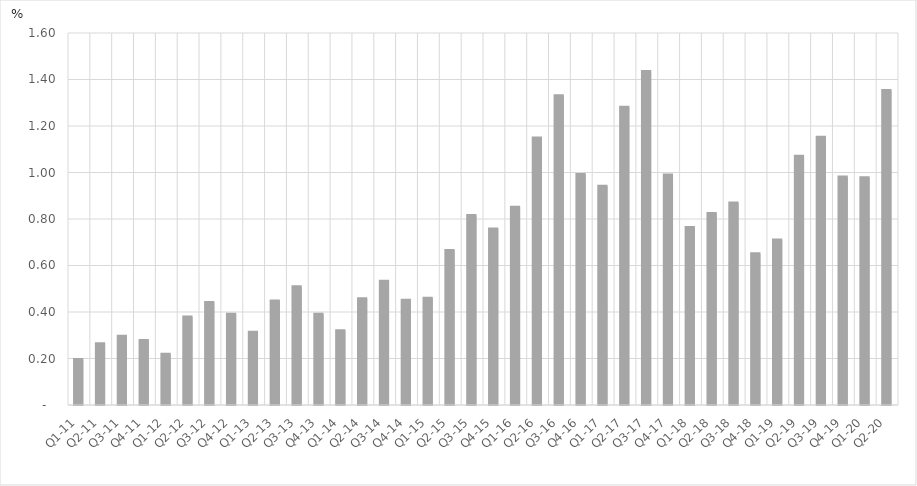
| Category | Percent of Total GDP |
|---|---|
| Q1-11 | 0.195 |
| Q2-11 | 0.264 |
| Q3-11 | 0.296 |
| Q4-11 | 0.278 |
| Q1-12 | 0.219 |
| Q2-12 | 0.379 |
| Q3-12 | 0.441 |
| Q4-12 | 0.391 |
| Q1-13 | 0.313 |
| Q2-13 | 0.448 |
| Q3-13 | 0.508 |
| Q4-13 | 0.39 |
| Q1-14 | 0.32 |
| Q2-14 | 0.457 |
| Q3-14 | 0.532 |
| Q4-14 | 0.45 |
| Q1-15 | 0.459 |
| Q2-15 | 0.664 |
| Q3-15 | 0.815 |
| Q4-15 | 0.756 |
| Q1-16 | 0.851 |
| Q2-16 | 1.148 |
| Q3-16 | 1.33 |
| Q4-16 | 0.992 |
| Q1-17 | 0.941 |
| Q2-17 | 1.281 |
| Q3-17 | 1.434 |
| Q4-17 | 0.99 |
| Q1-18 | 0.764 |
| Q2-18 | 0.824 |
| Q3-18 | 0.869 |
| Q4-18 | 0.651 |
| Q1-19 | 0.709 |
| Q2-19 | 1.069 |
| Q3-19 | 1.151 |
| Q4-19 | 0.981 |
| Q1-20 | 0.977 |
| Q2-20 | 1.353 |